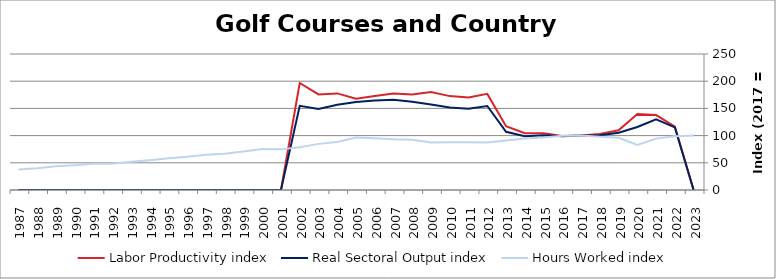
| Category | Labor Productivity index | Real Sectoral Output index | Hours Worked index |
|---|---|---|---|
| 2023.0 | 0 | 0 | 100.099 |
| 2022.0 | 116.625 | 114.996 | 98.603 |
| 2021.0 | 137.709 | 130.049 | 94.437 |
| 2020.0 | 139.575 | 115.819 | 82.979 |
| 2019.0 | 109.64 | 105.417 | 96.148 |
| 2018.0 | 103.001 | 100.649 | 97.716 |
| 2017.0 | 100 | 100 | 100 |
| 2016.0 | 99.321 | 98.959 | 99.636 |
| 2015.0 | 104.518 | 100.81 | 96.452 |
| 2014.0 | 104.309 | 98.819 | 94.737 |
| 2013.0 | 117.381 | 107.01 | 91.165 |
| 2012.0 | 176.69 | 154.391 | 87.38 |
| 2011.0 | 170.194 | 149.166 | 87.645 |
| 2010.0 | 172.573 | 151.624 | 87.861 |
| 2009.0 | 179.927 | 157.335 | 87.444 |
| 2008.0 | 175.474 | 162.241 | 92.458 |
| 2007.0 | 177.474 | 165.869 | 93.461 |
| 2006.0 | 172.749 | 164.723 | 95.354 |
| 2005.0 | 167.955 | 161.784 | 96.326 |
| 2004.0 | 177.568 | 156.769 | 88.287 |
| 2003.0 | 175.635 | 148.932 | 84.796 |
| 2002.0 | 196.675 | 154.795 | 78.706 |
| 2001.0 | 0 | 0 | 74.688 |
| 2000.0 | 0 | 0 | 75.259 |
| 1999.0 | 0 | 0 | 70.733 |
| 1998.0 | 0 | 0 | 66.847 |
| 1997.0 | 0 | 0 | 64.747 |
| 1996.0 | 0 | 0 | 61.166 |
| 1995.0 | 0 | 0 | 58.223 |
| 1994.0 | 0 | 0 | 54.904 |
| 1993.0 | 0 | 0 | 51.769 |
| 1992.0 | 0 | 0 | 48.362 |
| 1991.0 | 0 | 0 | 48.142 |
| 1990.0 | 0 | 0 | 45.613 |
| 1989.0 | 0 | 0 | 43.701 |
| 1988.0 | 0 | 0 | 39.895 |
| 1987.0 | 0 | 0 | 37.519 |